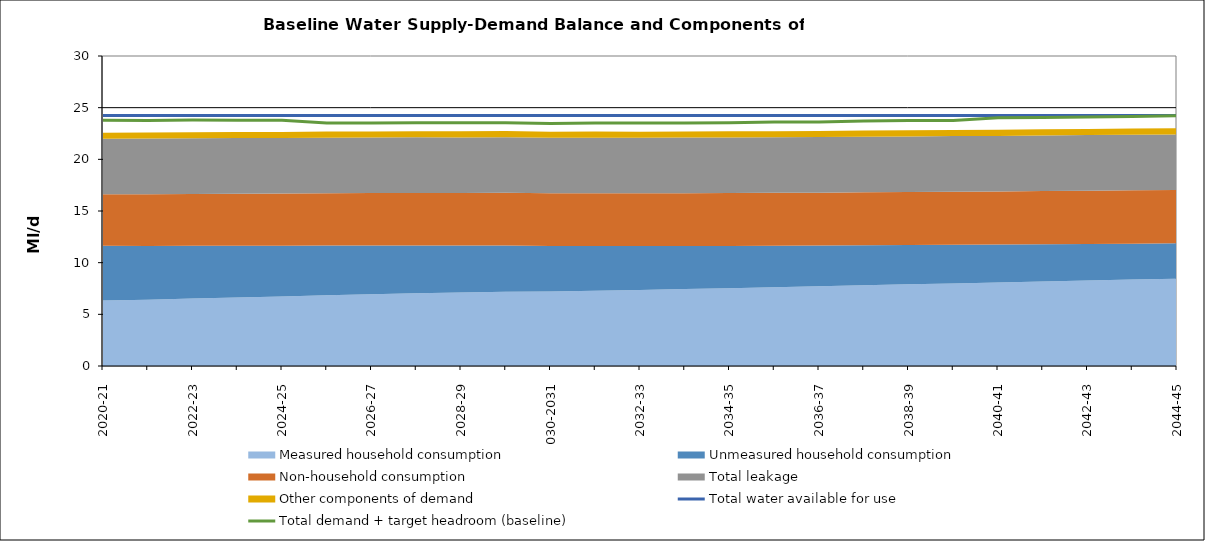
| Category | Total water available for use | Total demand + target headroom (baseline) |
|---|---|---|
| 0 | 24.24 | 23.772 |
| 1 | 24.24 | 23.769 |
| 2 | 24.24 | 23.795 |
| 3 | 24.24 | 23.787 |
| 4 | 24.24 | 23.784 |
| 5 | 24.24 | 23.517 |
| 6 | 24.24 | 23.521 |
| 7 | 24.24 | 23.546 |
| 8 | 24.24 | 23.532 |
| 9 | 24.24 | 23.55 |
| 10 | 24.24 | 23.46 |
| 11 | 24.24 | 23.505 |
| 12 | 24.24 | 23.516 |
| 13 | 24.24 | 23.518 |
| 14 | 24.24 | 23.547 |
| 15 | 24.24 | 23.618 |
| 16 | 24.24 | 23.62 |
| 17 | 24.24 | 23.72 |
| 18 | 24.24 | 23.748 |
| 19 | 24.24 | 23.768 |
| 20 | 24.24 | 24.015 |
| 21 | 24.24 | 24.052 |
| 22 | 24.24 | 24.097 |
| 23 | 24.24 | 24.143 |
| 24 | 24.24 | 24.217 |